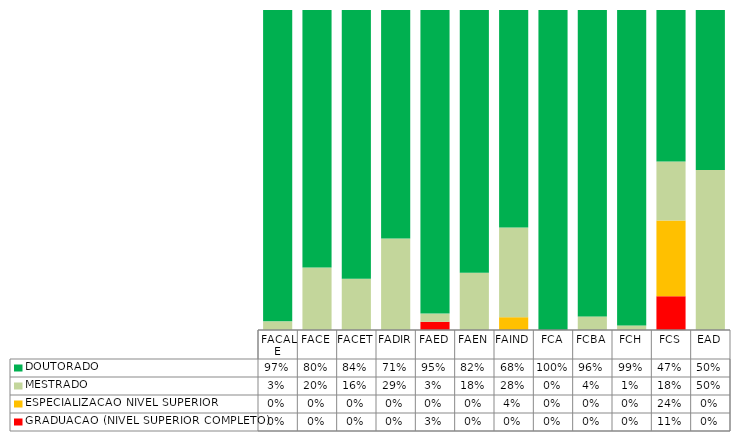
| Category | GRADUACAO (NIVEL SUPERIOR COMPLETO) | ESPECIALIZACAO NIVEL SUPERIOR | MESTRADO | DOUTORADO |
|---|---|---|---|---|
| FACALE | 0 | 0 | 0.027 | 0.973 |
| FACE | 0 | 0 | 0.195 | 0.805 |
| FACET | 0 | 0 | 0.16 | 0.84 |
| FADIR | 0 | 0 | 0.286 | 0.714 |
| FAED | 0.026 | 0 | 0.026 | 0.949 |
| FAEN | 0 | 0 | 0.179 | 0.821 |
| FAIND | 0 | 0.04 | 0.28 | 0.68 |
| FCA | 0 | 0 | 0 | 1 |
| FCBA | 0 | 0 | 0.043 | 0.957 |
| FCH | 0 | 0 | 0.014 | 0.986 |
| FCS | 0.105 | 0.237 | 0.184 | 0.474 |
| EAD | 0 | 0 | 0.5 | 0.5 |